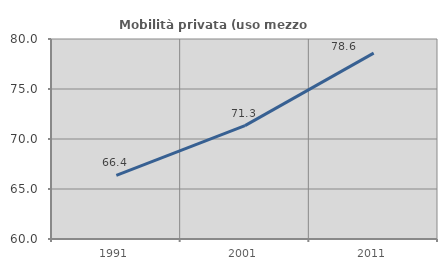
| Category | Mobilità privata (uso mezzo privato) |
|---|---|
| 1991.0 | 66.355 |
| 2001.0 | 71.333 |
| 2011.0 | 78.592 |